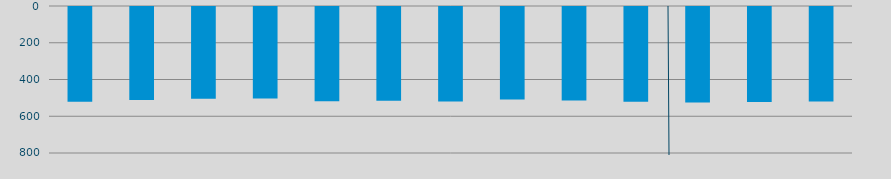
| Category | Energía a bajar | Energía a subir |
|---|---|---|
| M | 516.164 |  |
| A | 505.701 |  |
| M | 499.501 |  |
| J | 497.646 |  |
| J | 513.091 |  |
| A | 509.948 |  |
| S | 514.59 |  |
| O | 502.757 |  |
| N | 509.389 |  |
| D | 515.349 |  |
| E | 520.032 |  |
| F | 516.897 |  |
| M | 513.61 |  |